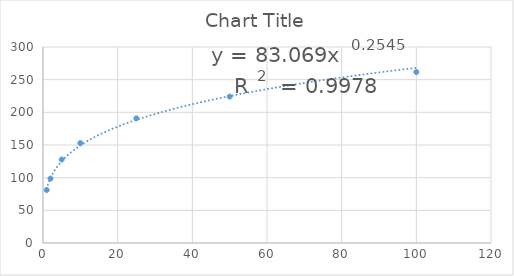
| Category | Series 0 |
|---|---|
| 1.0 | 81.045 |
| 2.0 | 98.575 |
| 5.0 | 127.792 |
| 10.0 | 152.944 |
| 25.0 | 190.799 |
| 50.0 | 224.081 |
| 100.0 | 261.682 |